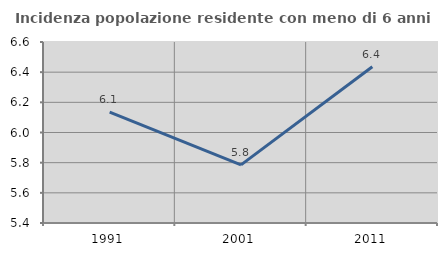
| Category | Incidenza popolazione residente con meno di 6 anni |
|---|---|
| 1991.0 | 6.135 |
| 2001.0 | 5.785 |
| 2011.0 | 6.436 |